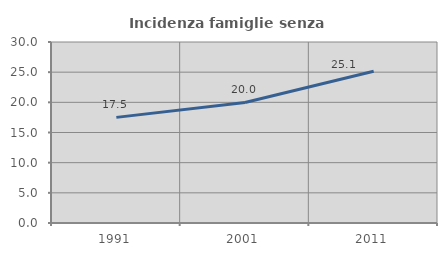
| Category | Incidenza famiglie senza nuclei |
|---|---|
| 1991.0 | 17.507 |
| 2001.0 | 19.976 |
| 2011.0 | 25.15 |